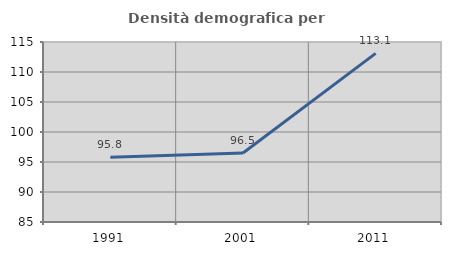
| Category | Densità demografica |
|---|---|
| 1991.0 | 95.784 |
| 2001.0 | 96.506 |
| 2011.0 | 113.111 |